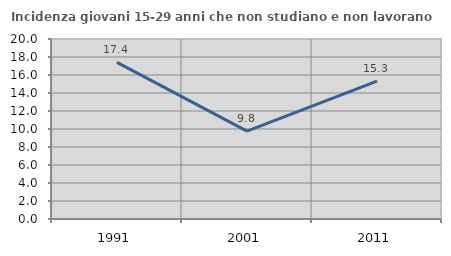
| Category | Incidenza giovani 15-29 anni che non studiano e non lavorano  |
|---|---|
| 1991.0 | 17.398 |
| 2001.0 | 9.762 |
| 2011.0 | 15.32 |